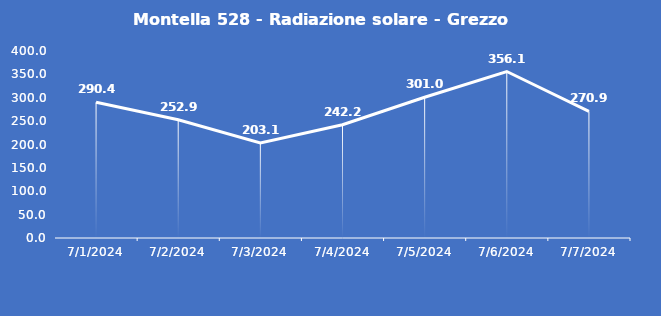
| Category | Montella 528 - Radiazione solare - Grezzo (W/m2) |
|---|---|
| 7/1/24 | 290.4 |
| 7/2/24 | 252.9 |
| 7/3/24 | 203.1 |
| 7/4/24 | 242.2 |
| 7/5/24 | 301 |
| 7/6/24 | 356.1 |
| 7/7/24 | 270.9 |